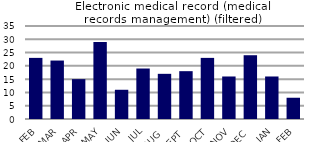
| Category | Electronic medical record (medical records management) (filtered) |
|---|---|
| FEB | 23 |
| MAR | 22 |
| APR | 15 |
| MAY | 29 |
| JUN | 11 |
| JUL | 19 |
| AUG | 17 |
| SEPT | 18 |
| OCT | 23 |
| NOV | 16 |
| DEC | 24 |
| JAN | 16 |
| FEB | 8 |